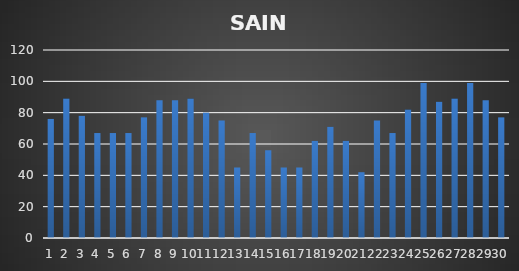
| Category | SAINS |
|---|---|
| 0 | 76 |
| 1 | 89 |
| 2 | 78 |
| 3 | 67 |
| 4 | 67 |
| 5 | 67 |
| 6 | 77 |
| 7 | 88 |
| 8 | 88 |
| 9 | 89 |
| 10 | 80 |
| 11 | 75 |
| 12 | 45 |
| 13 | 67 |
| 14 | 56 |
| 15 | 45 |
| 16 | 45 |
| 17 | 62 |
| 18 | 71 |
| 19 | 62 |
| 20 | 42 |
| 21 | 75 |
| 22 | 67 |
| 23 | 82 |
| 24 | 99 |
| 25 | 87 |
| 26 | 89 |
| 27 | 99 |
| 28 | 88 |
| 29 | 77 |